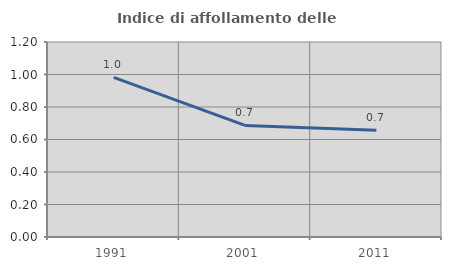
| Category | Indice di affollamento delle abitazioni  |
|---|---|
| 1991.0 | 0.983 |
| 2001.0 | 0.687 |
| 2011.0 | 0.657 |